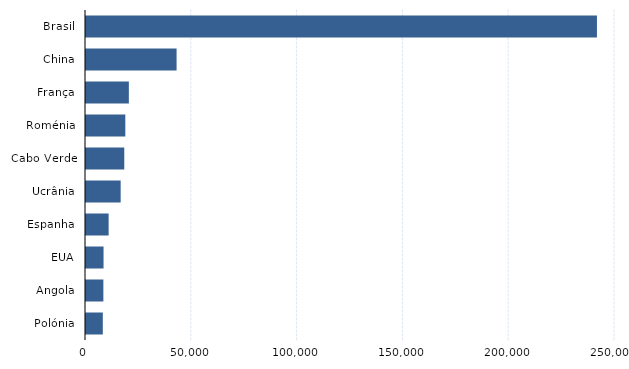
| Category | Series 0 |
|---|---|
| Brasil | 241470 |
| China | 42810 |
| França | 20250 |
| Roménia | 18580 |
| Cabo Verde | 18090 |
| Ucrânia | 16380 |
| Espanha | 10700 |
| EUA | 8290 |
| Angola | 8210 |
| Polónia | 7940 |